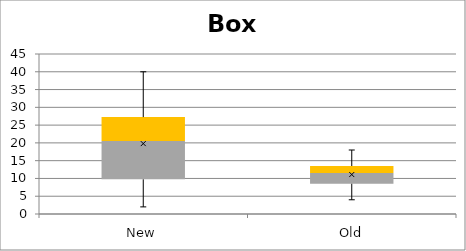
| Category | Min | Q1-Min | Med-Q1 | Q3-Med |
|---|---|---|---|---|
| New | 2 | 7.75 | 10.75 | 6.75 |
| Old | 4 | 4.5 | 3 | 2 |